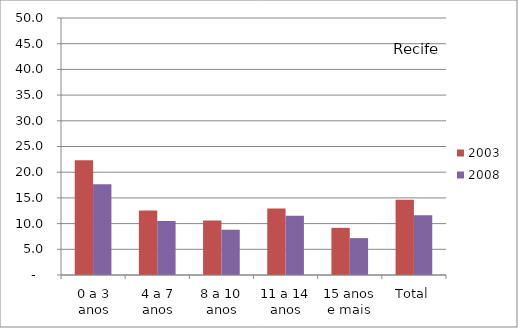
| Category | 2003 | 2008 |
|---|---|---|
| 0 a 3 anos | 22.31 | 17.67 |
| 4 a 7 anos | 12.55 | 10.49 |
| 8 a 10 anos | 10.59 | 8.81 |
| 11 a 14 anos | 12.92 | 11.53 |
| 15 anos e mais | 9.18 | 7.18 |
| Total | 14.65 | 11.63 |